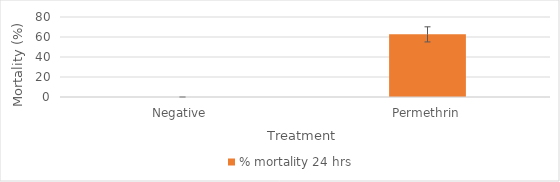
| Category | % mortality 24 hrs |
|---|---|
| Negative  | 0 |
| Permethrin | 62.626 |